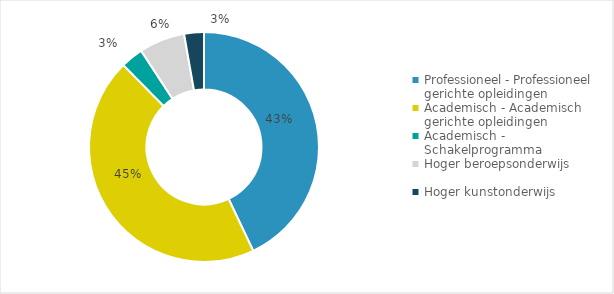
| Category | Series 1 |
|---|---|
| Professioneel - Professioneel gerichte opleidingen | 0.43 |
| Academisch - Academisch gerichte opleidingen | 0.447 |
| Academisch - Schakelprogramma | 0.032 |
| Hoger beroepsonderwijs | 0.064 |
| Hoger kunstonderwijs | 0.028 |